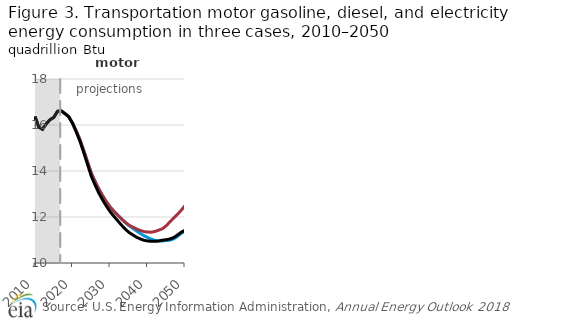
| Category | Autonomous battery electric vehicle | quadrilltion Btu | Reference |
|---|---|---|---|
| 2010.0 | 16.37 | 16.37 | 16.37 |
| 2011.0 | 15.907 | 15.907 | 15.907 |
| 2012.0 | 15.813 | 15.813 | 15.813 |
| 2013.0 | 16.051 | 16.051 | 16.051 |
| 2014.0 | 16.23 | 16.23 | 16.23 |
| 2015.0 | 16.329 | 16.329 | 16.329 |
| 2016.0 | 16.595 | 16.595 | 16.594 |
| 2017.0 | 16.614 | 16.614 | 16.612 |
| 2018.0 | 16.497 | 16.498 | 16.492 |
| 2019.0 | 16.358 | 16.359 | 16.355 |
| 2020.0 | 16.094 | 16.094 | 16.074 |
| 2021.0 | 15.737 | 15.737 | 15.698 |
| 2022.0 | 15.357 | 15.358 | 15.285 |
| 2023.0 | 14.884 | 14.886 | 14.803 |
| 2024.0 | 14.402 | 14.403 | 14.291 |
| 2025.0 | 13.913 | 13.914 | 13.777 |
| 2026.0 | 13.556 | 13.555 | 13.399 |
| 2027.0 | 13.228 | 13.228 | 13.05 |
| 2028.0 | 12.934 | 12.932 | 12.751 |
| 2029.0 | 12.677 | 12.673 | 12.481 |
| 2030.0 | 12.446 | 12.442 | 12.234 |
| 2031.0 | 12.259 | 12.256 | 12.036 |
| 2032.0 | 12.097 | 12.081 | 11.847 |
| 2033.0 | 11.936 | 11.92 | 11.659 |
| 2034.0 | 11.776 | 11.779 | 11.489 |
| 2035.0 | 11.633 | 11.653 | 11.335 |
| 2036.0 | 11.518 | 11.566 | 11.229 |
| 2037.0 | 11.402 | 11.485 | 11.129 |
| 2038.0 | 11.292 | 11.419 | 11.05 |
| 2039.0 | 11.192 | 11.369 | 10.991 |
| 2040.0 | 11.11 | 11.344 | 10.959 |
| 2041.0 | 11.038 | 11.341 | 10.942 |
| 2042.0 | 10.983 | 11.368 | 10.941 |
| 2043.0 | 10.965 | 11.43 | 10.955 |
| 2044.0 | 10.958 | 11.49 | 10.994 |
| 2045.0 | 10.975 | 11.622 | 11.012 |
| 2046.0 | 10.989 | 11.791 | 11.047 |
| 2047.0 | 11.05 | 11.959 | 11.108 |
| 2048.0 | 11.157 | 12.115 | 11.216 |
| 2049.0 | 11.286 | 12.298 | 11.341 |
| 2050.0 | 11.383 | 12.49 | 11.422 |